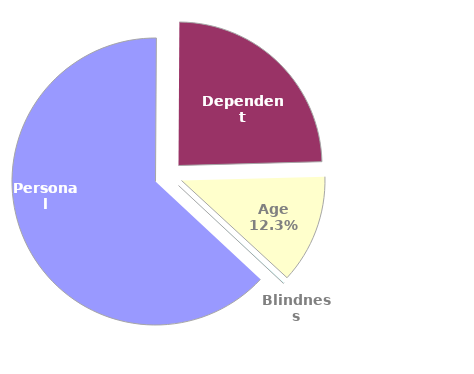
| Category | Series 0 |
|---|---|
| Personal | 5686037 |
| Dependent | 2203983 |
| Age | 1104975 |
| Blindness | 8641 |